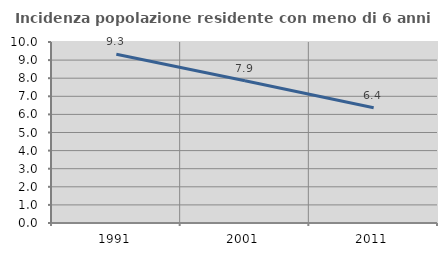
| Category | Incidenza popolazione residente con meno di 6 anni |
|---|---|
| 1991.0 | 9.325 |
| 2001.0 | 7.856 |
| 2011.0 | 6.371 |